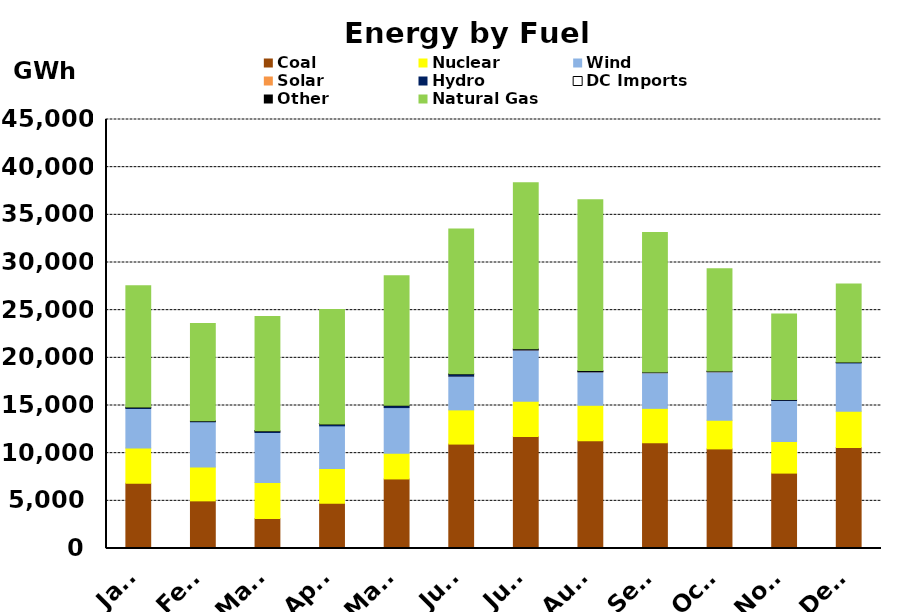
| Category | Coal | Nuclear | Wind | Solar | Hydro | DC Imports | Other | Natural Gas  |
|---|---|---|---|---|---|---|---|---|
| Jan* | 6853.636 | 3687.939 | 4099.732 | 43.64 | 94.432 | -13.091 | 50.992 | 12720.786 |
| Feb* | 4997.696 | 3556.202 | 4685.649 | 53.744 | 51.809 | -13.719 | 65.52 | 10199.432 |
| Mar* | 3135.064 | 3775.758 | 5207.56 | 51.907 | 82.291 | 40.146 | 51.764 | 11985.998 |
| Apr* | 4752.605 | 3651.204 | 4407.535 | 53.847 | 132.915 | 8.421 | 47.198 | 12018.257 |
| May* | 7295.59 | 2698.361 | 4737.72 | 49.49 | 192.001 | -55.582 | 56.796 | 13567.638 |
| Jun* | 10952.946 | 3587.904 | 3463.879 | 69.823 | 207.157 | -129.485 | 55.672 | 15183.989 |
| Jul* | 11743.823 | 3711.519 | 5265.818 | 93.311 | 76.628 | -129.349 | 53.263 | 17413.274 |
| Aug* | 11310.548 | 3710.145 | 3412.141 | 90.149 | 53.689 | -102.346 | 85.631 | 17912.816 |
| Sep* | 11103.571 | 3596.903 | 3637.52 | 101.957 | 37.427 | -184.256 | 42.962 | 14618.797 |
| Oct* | 10447.477 | 3005.437 | 4981.935 | 102.475 | 34.639 | -108.574 | 43.045 | 10729.979 |
| Nov* | 7908.262 | 3305.933 | 4250.959 | 66.627 | 52.623 | -90.129 | 57.927 | 8953.22 |
| Dec* | 10605.842 | 3803.424 | 4995.469 | 59.632 | 44.903 | -49.516 | 42.901 | 8188.098 |